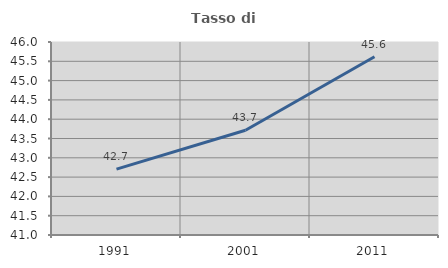
| Category | Tasso di occupazione   |
|---|---|
| 1991.0 | 42.707 |
| 2001.0 | 43.715 |
| 2011.0 | 45.619 |